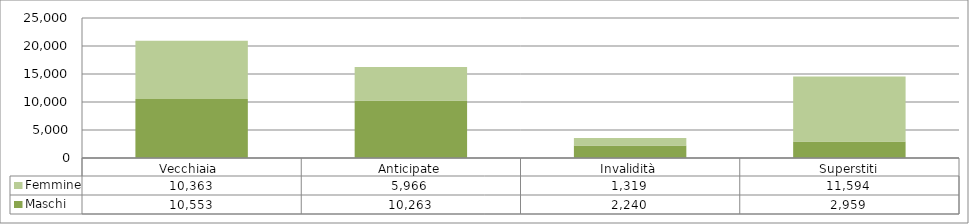
| Category | Maschi | Femmine |
|---|---|---|
| Vecchiaia  | 10553 | 10363 |
| Anticipate | 10263 | 5966 |
| Invalidità | 2240 | 1319 |
| Superstiti | 2959 | 11594 |